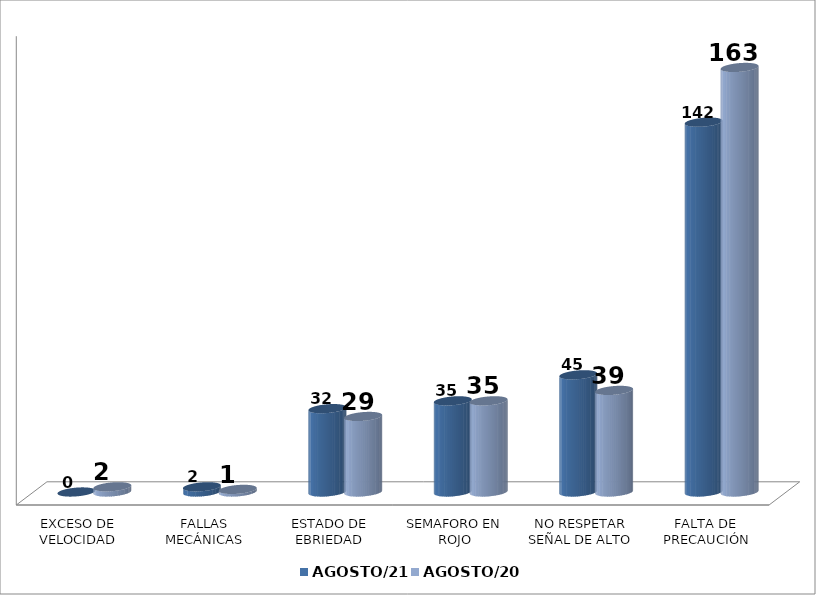
| Category | AGOSTO/21 | AGOSTO/20 |
|---|---|---|
| EXCESO DE VELOCIDAD | 0 | 2 |
| FALLAS MECÁNICAS | 2 | 1 |
| ESTADO DE EBRIEDAD | 32 | 29 |
| SEMAFORO EN ROJO | 35 | 35 |
| NO RESPETAR SEÑAL DE ALTO | 45 | 39 |
| FALTA DE PRECAUCIÓN | 142 | 163 |